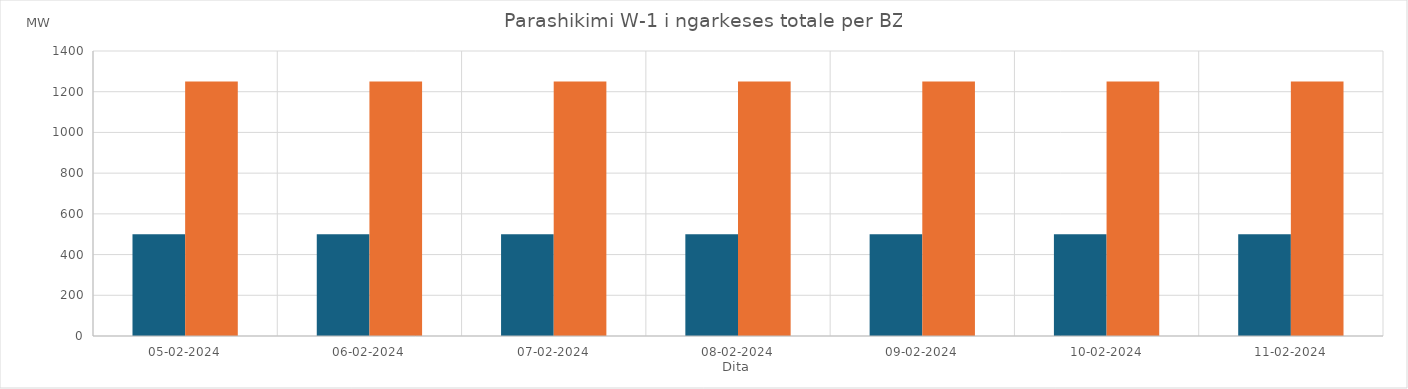
| Category | Min (MW) | Max (MW) |
|---|---|---|
| 05-02-2024 | 500 | 1250 |
| 06-02-2024 | 500 | 1250 |
| 07-02-2024 | 500 | 1250 |
| 08-02-2024 | 500 | 1250 |
| 09-02-2024 | 500 | 1250 |
| 10-02-2024 | 500 | 1250 |
| 11-02-2024 | 500 | 1250 |